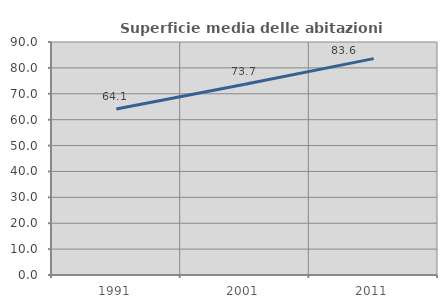
| Category | Superficie media delle abitazioni occupate |
|---|---|
| 1991.0 | 64.101 |
| 2001.0 | 73.688 |
| 2011.0 | 83.569 |